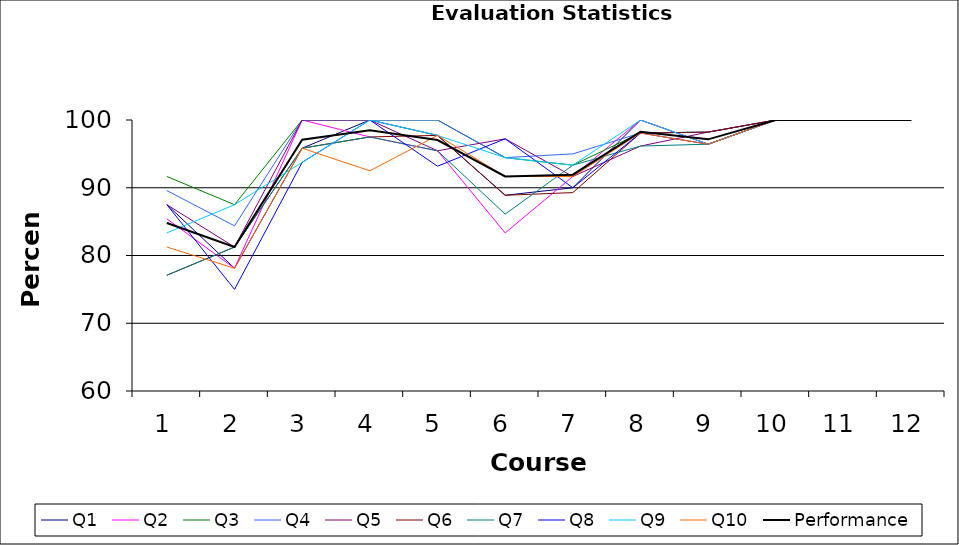
| Category | Q1 | Q2 | Q3 | Q4 | Q5 | Q6 | Q7 | Q8 | Q9 | Q10 | Performance |
|---|---|---|---|---|---|---|---|---|---|---|---|
| 0 | 87.5 | 85.417 | 91.667 | 89.583 | 87.5 | 77.083 | 77.083 | 87.5 | 83.333 | 81.25 | 84.792 |
| 1 | 78.125 | 78.125 | 87.5 | 84.375 | 81.25 | 81.25 | 81.25 | 75 | 87.5 | 78.125 | 81.25 |
| 2 | 95.833 | 100 | 100 | 100 | 100 | 95.833 | 95.833 | 93.75 | 93.75 | 95.833 | 97.083 |
| 3 | 100 | 97.5 | 100 | 100 | 100 | 97.5 | 97.5 | 100 | 100 | 92.5 | 98.5 |
| 4 | 97.727 | 95.455 | 100 | 100 | 95.455 | 97.727 | 95.455 | 93.182 | 97.727 | 97.727 | 97.045 |
| 5 | 88.889 | 83.333 | 94.444 | 94.444 | 97.222 | 88.889 | 86.111 | 97.222 | 94.444 | 91.667 | 91.667 |
| 6 | 90 | 91.667 | 93.333 | 95 | 91.667 | 89.286 | 93.333 | 90 | 93.333 | 91.667 | 91.929 |
| 7 | 100 | 100 | 98.077 | 98.077 | 96.154 | 98.077 | 96.154 | 98.077 | 100 | 98.077 | 98.269 |
| 8 | 96.429 | 96.429 | 98.214 | 98.214 | 98.214 | 98.214 | 96.429 | 96.429 | 96.429 | 96.429 | 97.143 |
| 9 | 100 | 100 | 100 | 100 | 100 | 100 | 100 | 100 | 100 | 100 | 100 |
| 10 | 100 | 100 | 100 | 100 | 100 | 100 | 100 | 100 | 100 | 100 | 100 |
| 11 | 100 | 100 | 100 | 100 | 100 | 100 | 100 | 100 | 100 | 100 | 100 |